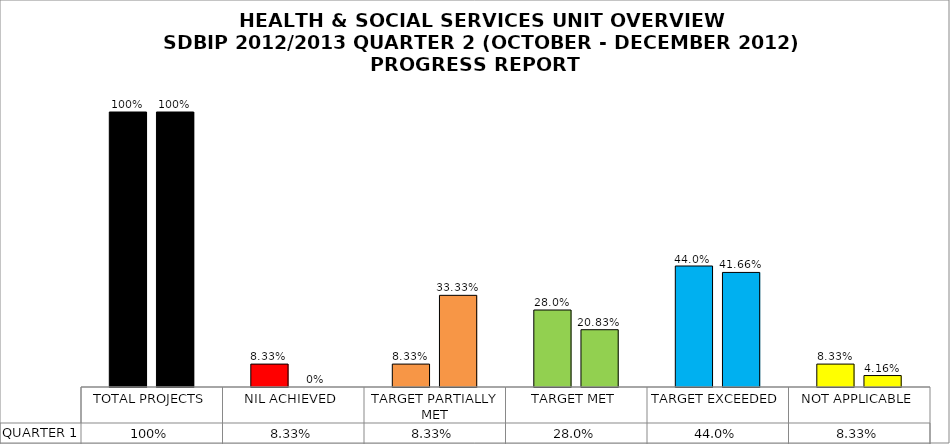
| Category | QUARTER 1 | QUARTER 2 |
|---|---|---|
| TOTAL PROJECTS | 1 | 1 |
| NIL ACHIEVED | 0.083 | 0 |
| TARGET PARTIALLY MET | 0.083 | 0.333 |
| TARGET MET | 0.28 | 0.208 |
| TARGET EXCEEDED | 0.44 | 0.417 |
| NOT APPLICABLE | 0.083 | 0.042 |